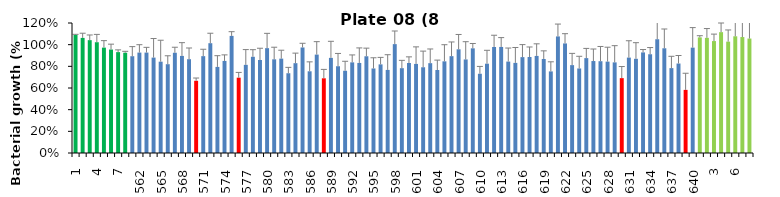
| Category | 8 h % |
|---|---|
| 1.0 | 1.089 |
| 2.0 | 1.062 |
| 3.0 | 1.042 |
| 4.0 | 1.023 |
| 5.0 | 0.973 |
| 6.0 | 0.955 |
| 7.0 | 0.931 |
| 8.0 | 0.925 |
| 561.0 | 0.893 |
| 562.0 | 0.927 |
| 563.0 | 0.927 |
| 564.0 | 0.881 |
| 565.0 | 0.843 |
| 566.0 | 0.82 |
| 567.0 | 0.925 |
| 568.0 | 0.896 |
| 569.0 | 0.866 |
| 570.0 | 0.667 |
| 571.0 | 0.894 |
| 572.0 | 1.014 |
| 573.0 | 0.795 |
| 574.0 | 0.85 |
| 575.0 | 1.081 |
| 576.0 | 0.695 |
| 577.0 | 0.814 |
| 578.0 | 0.888 |
| 579.0 | 0.858 |
| 580.0 | 0.968 |
| 581.0 | 0.865 |
| 582.0 | 0.871 |
| 583.0 | 0.736 |
| 584.0 | 0.829 |
| 585.0 | 0.974 |
| 586.0 | 0.754 |
| 587.0 | 0.908 |
| 588.0 | 0.69 |
| 589.0 | 0.878 |
| 590.0 | 0.801 |
| 591.0 | 0.759 |
| 592.0 | 0.837 |
| 593.0 | 0.831 |
| 594.0 | 0.893 |
| 595.0 | 0.78 |
| 596.0 | 0.818 |
| 597.0 | 0.767 |
| 598.0 | 1.005 |
| 599.0 | 0.783 |
| 600.0 | 0.831 |
| 601.0 | 0.822 |
| 602.0 | 0.792 |
| 603.0 | 0.829 |
| 604.0 | 0.766 |
| 605.0 | 0.846 |
| 606.0 | 0.894 |
| 607.0 | 0.957 |
| 608.0 | 0.864 |
| 609.0 | 0.966 |
| 610.0 | 0.731 |
| 611.0 | 0.824 |
| 612.0 | 0.978 |
| 613.0 | 0.979 |
| 614.0 | 0.844 |
| 615.0 | 0.832 |
| 616.0 | 0.885 |
| 617.0 | 0.886 |
| 618.0 | 0.896 |
| 619.0 | 0.868 |
| 620.0 | 0.753 |
| 621.0 | 1.076 |
| 622.0 | 1.011 |
| 623.0 | 0.811 |
| 624.0 | 0.78 |
| 625.0 | 0.876 |
| 626.0 | 0.849 |
| 627.0 | 0.847 |
| 628.0 | 0.844 |
| 629.0 | 0.837 |
| 630.0 | 0.691 |
| 631.0 | 0.881 |
| 632.0 | 0.87 |
| 633.0 | 0.929 |
| 634.0 | 0.912 |
| 635.0 | 1.05 |
| 636.0 | 0.967 |
| 637.0 | 0.784 |
| 638.0 | 0.826 |
| 639.0 | 0.583 |
| 640.0 | 0.973 |
| 1.0 | 1.067 |
| 2.0 | 1.063 |
| 3.0 | 1.033 |
| 4.0 | 1.116 |
| 5.0 | 1.028 |
| 6.0 | 1.077 |
| 7.0 | 1.07 |
| 8.0 | 1.057 |